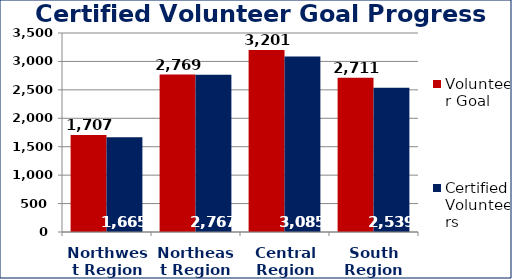
| Category | Volunteer Goal  | Certified Volunteers  |
|---|---|---|
| Northwest Region | 1707 | 1665 |
| Northeast Region | 2769 | 2767 |
| Central Region | 3201 | 3085 |
| South Region | 2711 | 2539 |